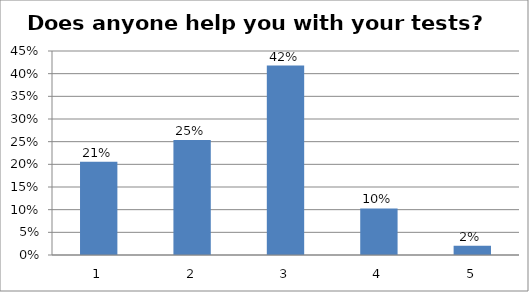
| Category | Series 0 |
|---|---|
| 0 | 0.205 |
| 1 | 0.253 |
| 2 | 0.418 |
| 3 | 0.103 |
| 4 | 0.021 |